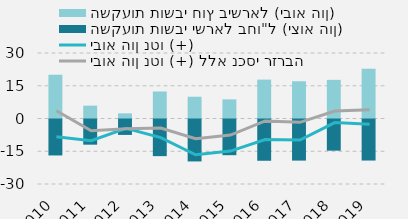
| Category | השקעות תושבי חוץ בישראל (יבוא הון) | השקעות תושבי ישראל בחו"ל (יצוא הון) |
|---|---|---|
| 0 | 20.041 | -16.466 |
| 1 | 5.885 | -11.53 |
| 2 | 2.351 | -7.064 |
| 3 | 12.381 | -16.78 |
| 4 | 9.967 | -19.199 |
| 5 | 8.756 | -16.35 |
| 6 | 17.802 | -18.899 |
| 7 | 17.056 | -18.824 |
| 8 | 17.7 | -14.276 |
| 9 | 22.8 | -18.8 |